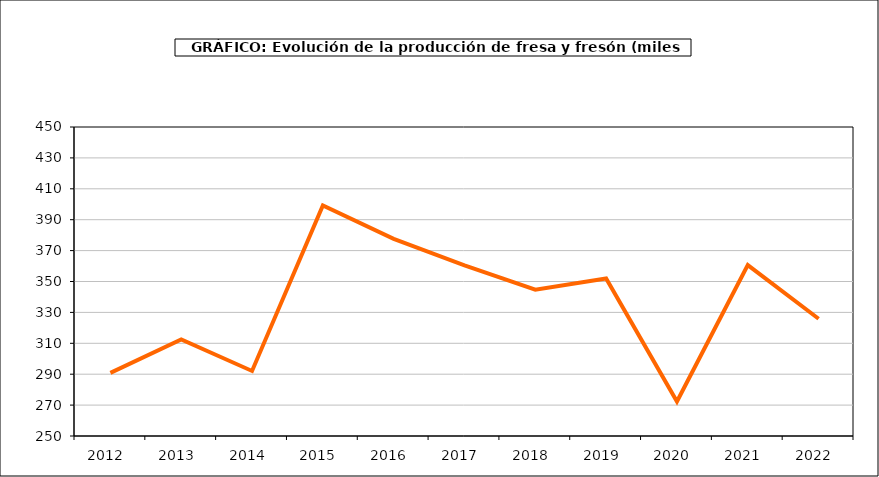
| Category | producción |
|---|---|
| 2012.0 | 290.843 |
| 2013.0 | 312.466 |
| 2014.0 | 292.101 |
| 2015.0 | 399.217 |
| 2016.0 | 377.596 |
| 2017.0 | 360.416 |
| 2018.0 | 344.679 |
| 2019.0 | 351.96 |
| 2020.0 | 272.345 |
| 2021.0 | 360.621 |
| 2022.0 | 325.878 |